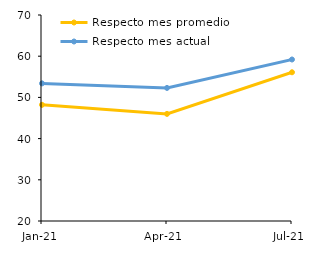
| Category | Respecto mes promedio | Respecto mes actual |
|---|---|---|
| 2021-01-01 | 48.2 | 53.4 |
| 2021-04-01 | 46 | 52.3 |
| 2021-07-01 | 56.1 | 59.2 |